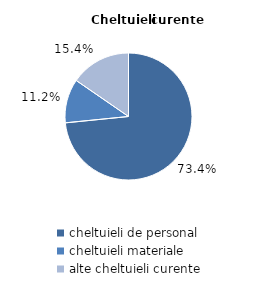
| Category | Series 0 |
|---|---|
| cheltuieli de personal | 73.4 |
| cheltuieli materiale | 11.2 |
| alte cheltuieli curente | 15.4 |